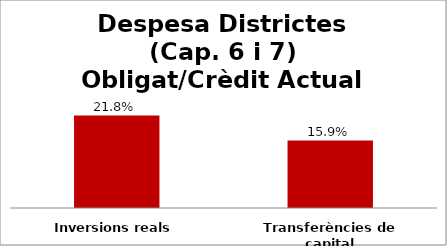
| Category | Series 0 |
|---|---|
| Inversions reals | 0.218 |
| Transferències de capital | 0.159 |